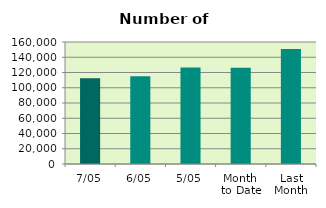
| Category | Series 0 |
|---|---|
| 7/05 | 112614 |
| 6/05 | 115078 |
| 5/05 | 126704 |
| Month 
to Date | 126306 |
| Last
Month | 150855.6 |